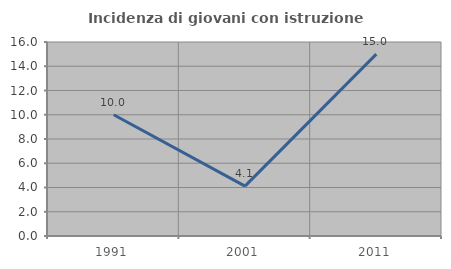
| Category | Incidenza di giovani con istruzione universitaria |
|---|---|
| 1991.0 | 10 |
| 2001.0 | 4.11 |
| 2011.0 | 15 |